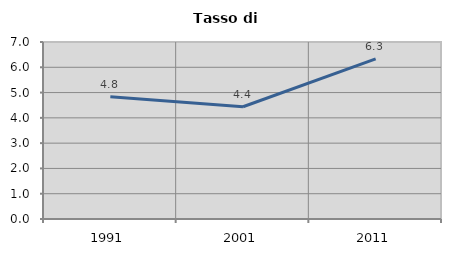
| Category | Tasso di disoccupazione   |
|---|---|
| 1991.0 | 4.833 |
| 2001.0 | 4.439 |
| 2011.0 | 6.335 |